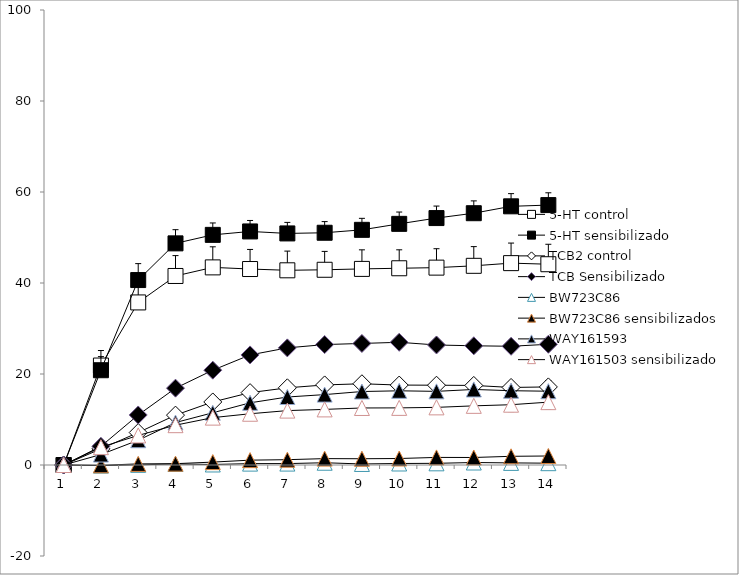
| Category | 5-HT control | 5-HT sensibilizado | TCB2 control | TCB Sensibilizado | BW723C86 | BW723C86 sensibilizados | WAY161593 | WAY161503 sensibilizado |
|---|---|---|---|---|---|---|---|---|
| 0 | 0 | 0 | 0 | 0 | 0 | 0 | 0 | 0 |
| 1 | 21.859 | 20.83 | 3.556 | 4.105 | -0.14 | -0.065 | 2.301 | 3.92 |
| 2 | 35.73 | 40.647 | 7.131 | 10.994 | 0.034 | 0.246 | 5.446 | 6.498 |
| 3 | 41.544 | 48.71 | 10.965 | 16.885 | 0.225 | 0.289 | 9.328 | 8.753 |
| 4 | 43.431 | 50.579 | 13.855 | 20.836 | 0.116 | 0.639 | 11.479 | 10.412 |
| 5 | 43.071 | 51.331 | 15.906 | 24.193 | 0.304 | 1.067 | 13.666 | 11.261 |
| 6 | 42.792 | 50.895 | 16.963 | 25.742 | 0.311 | 1.169 | 14.942 | 11.955 |
| 7 | 42.908 | 51.043 | 17.599 | 26.467 | 0.497 | 1.401 | 15.471 | 12.219 |
| 8 | 43.1 | 51.684 | 17.855 | 26.714 | 0.227 | 1.374 | 16.15 | 12.532 |
| 9 | 43.241 | 52.999 | 17.566 | 26.971 | 0.33 | 1.427 | 16.306 | 12.554 |
| 10 | 43.378 | 54.271 | 17.536 | 26.376 | 0.368 | 1.668 | 16.184 | 12.666 |
| 11 | 43.777 | 55.339 | 17.489 | 26.201 | 0.547 | 1.65 | 16.606 | 13 |
| 12 | 44.366 | 56.853 | 17.043 | 26.094 | 0.463 | 1.912 | 16.326 | 13.25 |
| 13 | 44.127 | 57.124 | 17.163 | 26.533 | 0.4 | 1.98 | 16.214 | 13.813 |